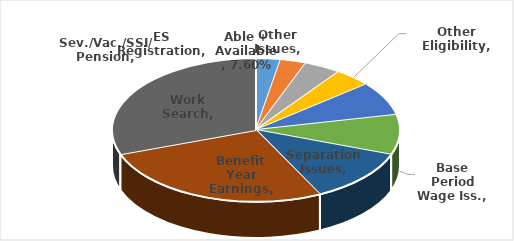
| Category | Series 0 |
|---|---|
| Other Issues | 0.028 |
| ES Registration | 0.029 |
| Sev./Vac./SSI/ Pension | 0.041 |
| Other Eligibility | 0.042 |
| Able + Available | 0.076 |
| Base Period Wage Iss. | 0.09 |
| Separation Issues | 0.121 |
| Benefit Year Earnings | 0.268 |
| Work Search | 0.305 |